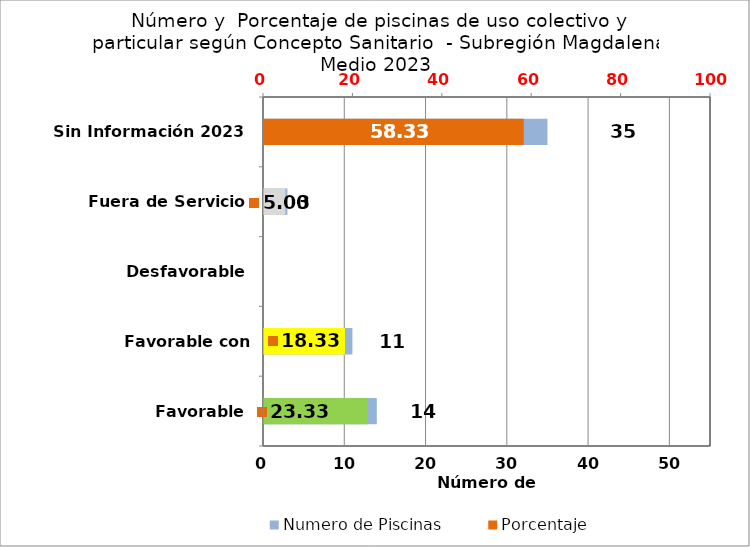
| Category | Numero de Piscinas |
|---|---|
| Favorable | 14 |
| Favorable con Requerimientos | 11 |
| Desfavorable | 0 |
| Fuera de Servicio | 3 |
| Sin Información 2023 | 35 |